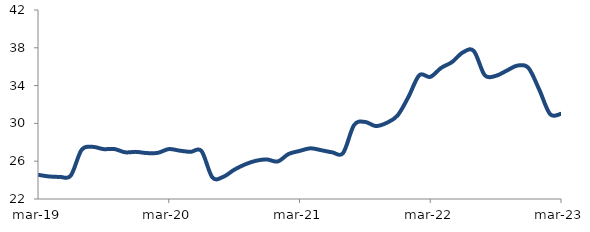
| Category | Series 0 |
|---|---|
| 2019-03-01 | 24.563 |
| 2019-04-01 | 24.388 |
| 2019-05-01 | 24.342 |
| 2019-06-01 | 24.467 |
| 2019-07-01 | 27.194 |
| 2019-08-01 | 27.519 |
| 2019-09-01 | 27.279 |
| 2019-10-01 | 27.289 |
| 2019-11-01 | 26.942 |
| 2019-12-01 | 26.986 |
| 2020-01-01 | 26.86 |
| 2020-02-01 | 26.885 |
| 2020-03-01 | 27.282 |
| 2020-04-01 | 27.118 |
| 2020-05-01 | 26.986 |
| 2020-06-01 | 27.082 |
| 2020-07-01 | 24.291 |
| 2020-08-01 | 24.343 |
| 2020-09-01 | 25.089 |
| 2020-10-01 | 25.658 |
| 2020-11-01 | 26.044 |
| 2020-12-01 | 26.188 |
| 2021-01-01 | 25.972 |
| 2021-02-01 | 26.764 |
| 2021-03-01 | 27.083 |
| 2021-04-01 | 27.363 |
| 2021-05-01 | 27.164 |
| 2021-06-01 | 26.939 |
| 2021-07-01 | 26.864 |
| 2021-08-01 | 29.808 |
| 2021-09-01 | 30.158 |
| 2021-10-01 | 29.722 |
| 2021-11-01 | 30.058 |
| 2021-12-01 | 30.839 |
| 2022-01-01 | 32.807 |
| 2022-02-01 | 35.105 |
| 2022-03-01 | 34.922 |
| 2022-04-01 | 35.874 |
| 2022-05-01 | 36.493 |
| 2022-06-01 | 37.518 |
| 2022-07-01 | 37.658 |
| 2022-08-01 | 35.102 |
| 2022-09-01 | 35.026 |
| 2022-10-01 | 35.57 |
| 2022-11-01 | 36.115 |
| 2022-12-01 | 35.887 |
| 2023-01-01 | 33.585 |
| 2023-02-01 | 30.978 |
| 2023-03-01 | 31.014 |